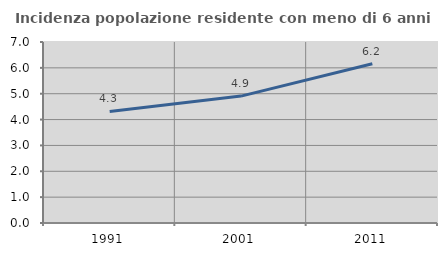
| Category | Incidenza popolazione residente con meno di 6 anni |
|---|---|
| 1991.0 | 4.315 |
| 2001.0 | 4.908 |
| 2011.0 | 6.158 |